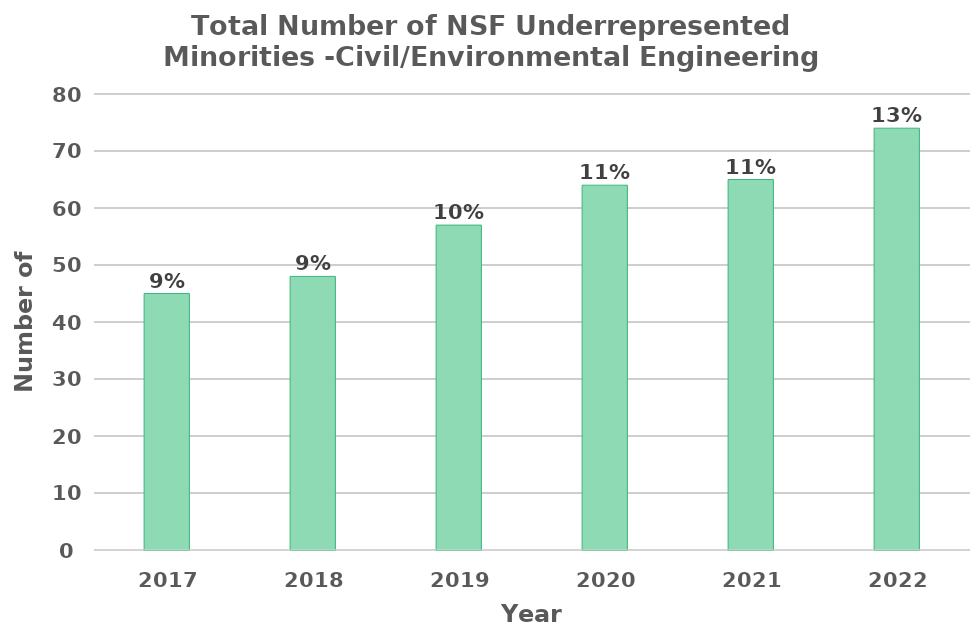
| Category | Total Number of NSF Underrepresented Mechanical Engineering Students |
|---|---|
| 2017.0 | 45 |
| 2018.0 | 48 |
| 2019.0 | 57 |
| 2020.0 | 64 |
| 2021.0 | 65 |
| 2022.0 | 74 |